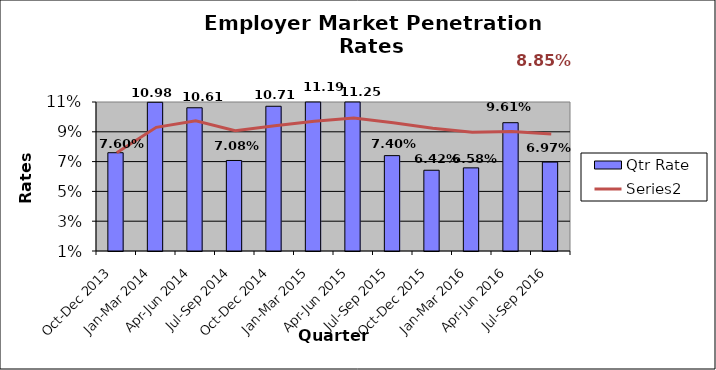
| Category | Qtr Rate |
|---|---|
| Oct-Dec 2013 | 0.076 |
| Jan-Mar 2014 | 0.11 |
| Apr-Jun 2014 | 0.106 |
| Jul-Sep 2014 | 0.071 |
| Oct-Dec 2014 | 0.107 |
| Jan-Mar 2015 | 0.112 |
| Apr-Jun 2015 | 0.112 |
| Jul-Sep 2015 | 0.074 |
| Oct-Dec 2015 | 0.064 |
| Jan-Mar 2016 | 0.066 |
| Apr-Jun 2016 | 0.096 |
| Jul-Sep 2016 | 0.07 |